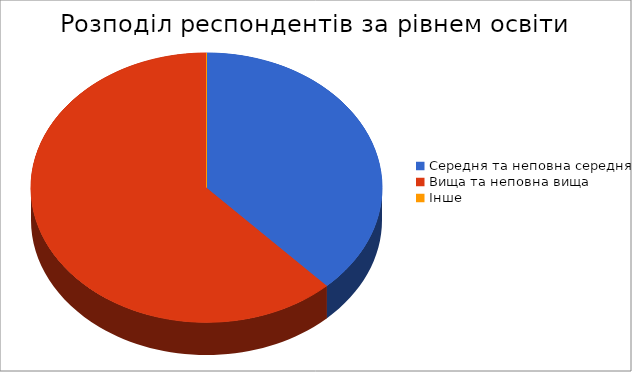
| Category | Series 0 |
|---|---|
| Середня та неповна середня | 19 |
| Вища та неповна вища | 31 |
| Інше | 0 |